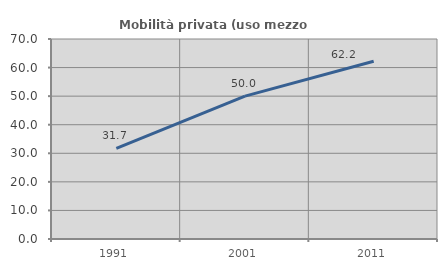
| Category | Mobilità privata (uso mezzo privato) |
|---|---|
| 1991.0 | 31.733 |
| 2001.0 | 50.022 |
| 2011.0 | 62.207 |